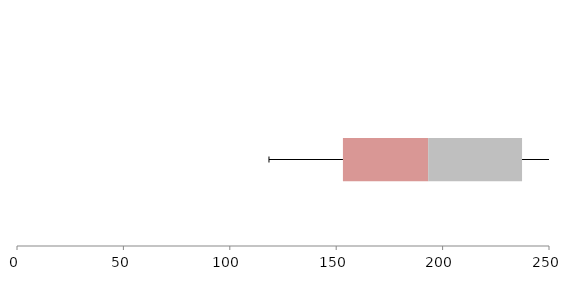
| Category | Series 1 | Series 2 | Series 3 |
|---|---|---|---|
| 0 | 153.162 | 40.059 | 44.112 |